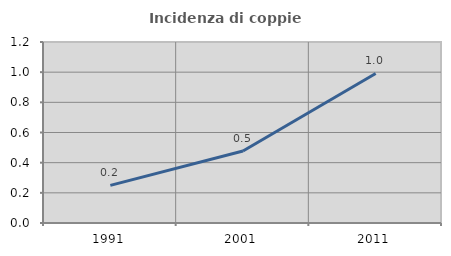
| Category | Incidenza di coppie miste |
|---|---|
| 1991.0 | 0.25 |
| 2001.0 | 0.478 |
| 2011.0 | 0.992 |